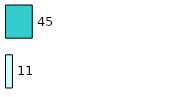
| Category | Series 0 | Series 1 |
|---|---|---|
| 0 | 11 | 45 |